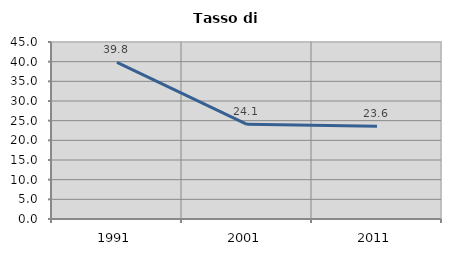
| Category | Tasso di disoccupazione   |
|---|---|
| 1991.0 | 39.811 |
| 2001.0 | 24.083 |
| 2011.0 | 23.596 |